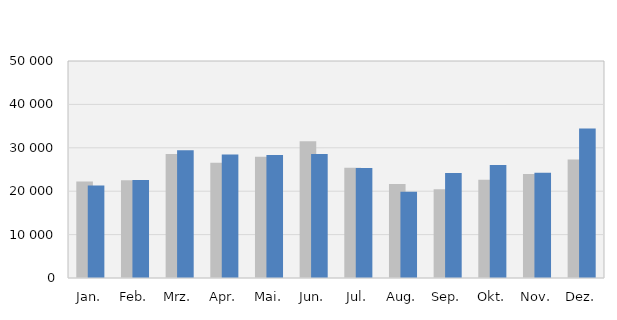
| Category | 2018 | 2019 |
|---|---|---|
| Jan. | 22258 | 21336 |
| Feb. | 22536 | 22609 |
| Mrz. | 28581 | 29458 |
| Apr. | 26558 | 28461 |
| Mai. | 27942 | 28339 |
| Jun. | 31536 | 28600 |
| Jul. | 25379 | 25319 |
| Aug. | 21680 | 19882 |
| Sep. | 20462 | 24221 |
| Okt. | 22666 | 26015 |
| Nov. | 23986 | 24243 |
| Dez. | 27303 | 34419 |